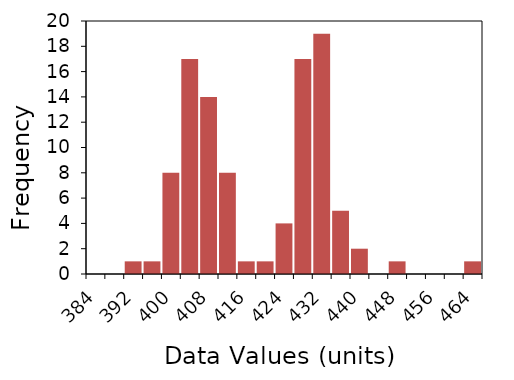
| Category | Series 1 |
|---|---|
| 384.0 | 0 |
| 388.0 | 0 |
| 392.0 | 1 |
| 396.0 | 1 |
| 400.0 | 8 |
| 404.0 | 17 |
| 408.0 | 14 |
| 412.0 | 8 |
| 416.0 | 1 |
| 420.0 | 1 |
| 424.0 | 4 |
| 428.0 | 17 |
| 432.0 | 19 |
| 436.0 | 5 |
| 440.0 | 2 |
| 444.0 | 0 |
| 448.0 | 1 |
| 452.0 | 0 |
| 456.0 | 0 |
| 460.0 | 0 |
| 464.0 | 1 |